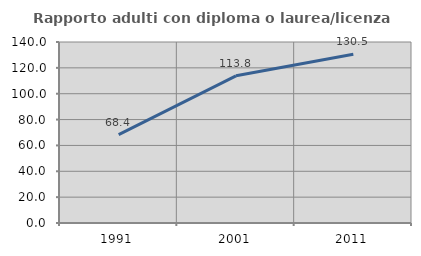
| Category | Rapporto adulti con diploma o laurea/licenza media  |
|---|---|
| 1991.0 | 68.421 |
| 2001.0 | 113.846 |
| 2011.0 | 130.516 |